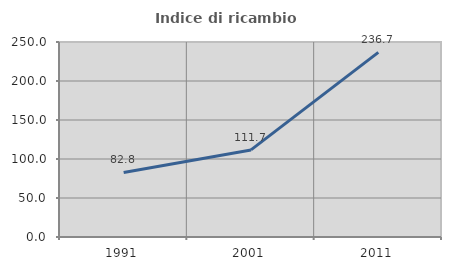
| Category | Indice di ricambio occupazionale  |
|---|---|
| 1991.0 | 82.787 |
| 2001.0 | 111.667 |
| 2011.0 | 236.744 |